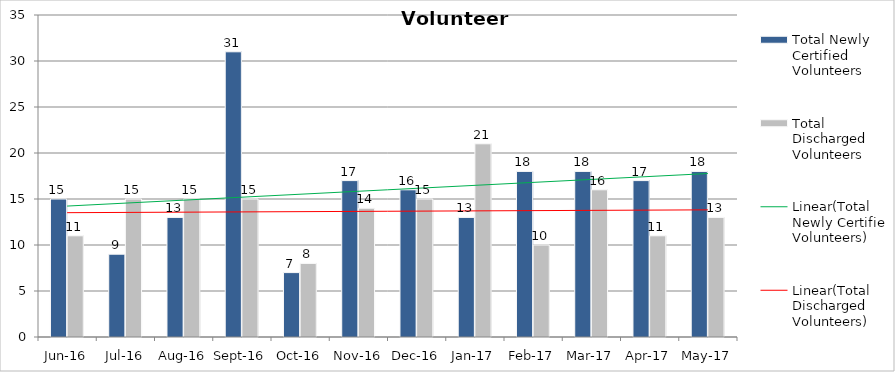
| Category | Total Newly Certified Volunteers | Total Discharged Volunteers |
|---|---|---|
| Jun-16 | 15 | 11 |
| Jul-16 | 9 | 15 |
| Aug-16 | 13 | 15 |
| Sep-16 | 31 | 15 |
| Oct-16 | 7 | 8 |
| Nov-16 | 17 | 14 |
| Dec-16 | 16 | 15 |
| Jan-17 | 13 | 21 |
| Feb-17 | 18 | 10 |
| Mar-17 | 18 | 16 |
| Apr-17 | 17 | 11 |
| May-17 | 18 | 13 |